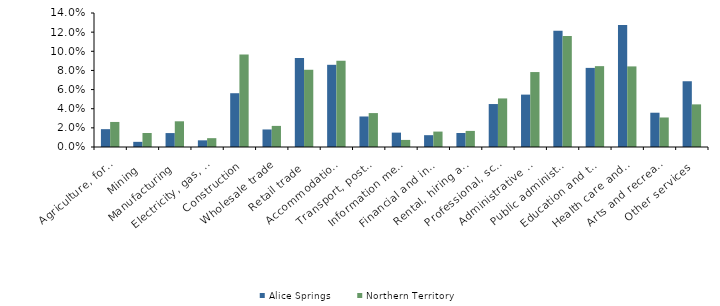
| Category | Alice Springs | Northern Territory |
|---|---|---|
| Agriculture, forestry and fishing | 0.019 | 0.026 |
| Mining | 0.005 | 0.015 |
| Manufacturing | 0.015 | 0.027 |
| Electricity, gas, water and waste services | 0.007 | 0.009 |
| Construction | 0.056 | 0.097 |
| Wholesale trade | 0.018 | 0.022 |
| Retail trade | 0.093 | 0.081 |
| Accommodation and food services | 0.086 | 0.09 |
| Transport, postal and warehousing | 0.032 | 0.035 |
| Information media and telecommunications | 0.015 | 0.007 |
| Financial and insurance services | 0.012 | 0.016 |
| Rental, hiring and real estate services | 0.015 | 0.017 |
| Professional, scientific and technical services | 0.045 | 0.051 |
| Administrative and support services | 0.055 | 0.078 |
| Public administration and safety | 0.121 | 0.116 |
| Education and training | 0.083 | 0.084 |
| Health care and social assistance | 0.128 | 0.084 |
| Arts and recreation services | 0.036 | 0.031 |
| Other services | 0.069 | 0.045 |